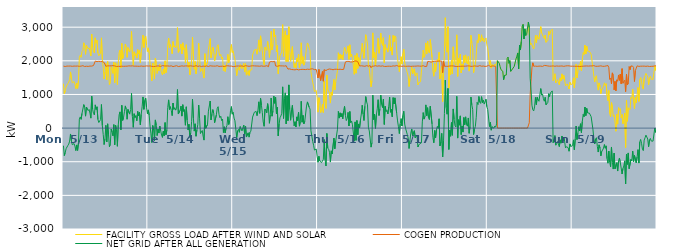
| Category | FACILITY GROSS LOAD AFTER WIND AND SOLAR | COGEN PRODUCTION | NET GRID AFTER ALL GENERATION |
|---|---|---|---|
|  Mon  5/13 | 1320 | 1843 | -523 |
|  Mon  5/13 | 1023 | 1841 | -818 |
|  Mon  5/13 | 1105 | 1831 | -726 |
|  Mon  5/13 | 1222 | 1835 | -613 |
|  Mon  5/13 | 1245 | 1844 | -599 |
|  Mon  5/13 | 1327 | 1844 | -517 |
|  Mon  5/13 | 1367 | 1843 | -476 |
|  Mon  5/13 | 1450 | 1837 | -387 |
|  Mon  5/13 | 1670 | 1845 | -175 |
|  Mon  5/13 | 1466 | 1844 | -378 |
|  Mon  5/13 | 1342 | 1837 | -495 |
|  Mon  5/13 | 1370 | 1836 | -466 |
|  Mon  5/13 | 1384 | 1844 | -460 |
|  Mon  5/13 | 1302 | 1836 | -534 |
|  Mon  5/13 | 1174 | 1842 | -668 |
|  Mon  5/13 | 1335 | 1836 | -501 |
|  Mon  5/13 | 1181 | 1845 | -664 |
|  Mon  5/13 | 1411 | 1851 | -440 |
|  Mon  5/13 | 2104 | 1837 | 267 |
|  Mon  5/13 | 2166 | 1833 | 333 |
|  Mon  5/13 | 2102 | 1842 | 260 |
|  Mon  5/13 | 2278 | 1841 | 437 |
|  Mon  5/13 | 2309 | 1855 | 454 |
|  Mon  5/13 | 2536 | 1838 | 698 |
|  Mon  5/13 | 2449 | 1831 | 618 |
|  Mon  5/13 | 2194 | 1839 | 355 |
|  Mon  5/13 | 2466 | 1839 | 627 |
|  Mon  5/13 | 2412 | 1845 | 567 |
|  Mon  5/13 | 2354 | 1834 | 520 |
|  Mon  5/13 | 2386 | 1832 | 554 |
|  Mon  5/13 | 2291 | 1844 | 447 |
|  Mon  5/13 | 2143 | 1847 | 296 |
|  Mon  5/13 | 2790 | 1843 | 947 |
|  Mon  5/13 | 2402 | 1840 | 562 |
|  Mon  5/13 | 2296 | 1859 | 437 |
|  Mon  5/13 | 2232 | 1842 | 390 |
|  Mon  5/13 | 2683 | 1992 | 691 |
|  Mon  5/13 | 2526 | 1974 | 552 |
|  Mon  5/13 | 2609 | 1976 | 633 |
|  Mon  5/13 | 2234 | 1979 | 255 |
|  Mon  5/13 | 2149 | 1984 | 165 |
|  Mon  5/13 | 2176 | 1988 | 188 |
|  Mon  5/13 | 2231 | 1977 | 254 |
|  Mon  5/13 | 2683 | 1983 | 700 |
|  Mon  5/13 | 2049 | 1976 | 73 |
|  Mon  5/13 | 1787 | 1979 | -192 |
|  Mon  5/13 | 1464 | 1953 | -489 |
|  Mon  5/13 | 1664 | 1981 | -317 |
|  Mon  5/13 | 1919 | 1837 | 82 |
|  Mon  5/13 | 1433 | 1845 | -412 |
|  Mon  5/13 | 1977 | 1850 | 127 |
|  Mon  5/13 | 1646 | 1843 | -197 |
|  Mon  5/13 | 1296 | 1850 | -554 |
|  Mon  5/13 | 1360 | 1843 | -483 |
|  Mon  5/13 | 1823 | 1851 | -28 |
|  Mon  5/13 | 1722 | 1838 | -116 |
|  Mon  5/13 | 1626 | 1857 | -231 |
|  Mon  5/13 | 1955 | 1852 | 103 |
|  Mon  5/13 | 1352 | 1849 | -497 |
|  Mon  5/13 | 1938 | 1855 | 83 |
|  Mon  5/13 | 1788 | 1831 | -43 |
|  Mon  5/13 | 1297 | 1838 | -541 |
|  Mon  5/13 | 1924 | 1837 | 87 |
|  Mon  5/13 | 2241 | 1845 | 396 |
|  Mon  5/13 | 2317 | 1834 | 483 |
|  Mon  5/13 | 1788 | 1839 | -51 |
|  Mon  5/13 | 2518 | 1841 | 677 |
|  Mon  5/13 | 2063 | 1835 | 228 |
|  Mon  5/13 | 2156 | 1837 | 319 |
|  Mon  5/13 | 2318 | 1830 | 488 |
|  Mon  5/13 | 2499 | 1839 | 660 |
|  Mon  5/13 | 2403 | 1844 | 559 |
|  Mon  5/13 | 2104 | 1841 | 263 |
|  Mon  5/13 | 2395 | 1840 | 555 |
|  Mon  5/13 | 2420 | 1849 | 571 |
|  Mon  5/13 | 2263 | 1848 | 415 |
|  Mon  5/13 | 2400 | 1846 | 554 |
|  Mon  5/13 | 2872 | 1839 | 1033 |
|  Mon  5/13 | 2197 | 1850 | 347 |
|  Mon  5/13 | 1872 | 1848 | 24 |
|  Mon  5/13 | 2268 | 1841 | 427 |
|  Mon  5/13 | 2158 | 1846 | 312 |
|  Mon  5/13 | 2217 | 1842 | 375 |
|  Mon  5/13 | 2081 | 1865 | 216 |
|  Mon  5/13 | 2335 | 1839 | 496 |
|  Mon  5/13 | 2202 | 1842 | 360 |
|  Mon  5/13 | 2309 | 1837 | 472 |
|  Mon  5/13 | 1941 | 1844 | 97 |
|  Mon  5/13 | 2254 | 1846 | 408 |
|  Mon  5/13 | 2465 | 1833 | 632 |
|  Mon  5/13 | 2764 | 1838 | 926 |
|  Mon  5/13 | 2394 | 1837 | 557 |
|  Mon  5/13 | 2664 | 1839 | 825 |
|  Mon  5/13 | 2736 | 1842 | 894 |
|  Mon  5/13 | 2461 | 1849 | 612 |
|  Mon  5/13 | 2276 | 1852 | 424 |
|  Tue  5/14 | 2385 | 1844 | 541 |
|  Tue  5/14 | 2236 | 1853 | 383 |
|  Tue  5/14 | 1905 | 1847 | 58 |
|  Tue  5/14 | 1672 | 1844 | -172 |
|  Tue  5/14 | 1406 | 1836 | -430 |
|  Tue  5/14 | 1935 | 1858 | 77 |
|  Tue  5/14 | 1771 | 1829 | -58 |
|  Tue  5/14 | 1458 | 1832 | -374 |
|  Tue  5/14 | 2079 | 1836 | 243 |
|  Tue  5/14 | 1929 | 1845 | 84 |
|  Tue  5/14 | 1624 | 1847 | -223 |
|  Tue  5/14 | 1817 | 1843 | -26 |
|  Tue  5/14 | 1699 | 1847 | -148 |
|  Tue  5/14 | 1904 | 1845 | 59 |
|  Tue  5/14 | 1756 | 1832 | -76 |
|  Tue  5/14 | 1641 | 1849 | -208 |
|  Tue  5/14 | 1581 | 1858 | -277 |
|  Tue  5/14 | 1752 | 1845 | -93 |
|  Tue  5/14 | 1619 | 1848 | -229 |
|  Tue  5/14 | 2001 | 1837 | 164 |
|  Tue  5/14 | 1649 | 1846 | -197 |
|  Tue  5/14 | 1783 | 1844 | -61 |
|  Tue  5/14 | 2460 | 1848 | 612 |
|  Tue  5/14 | 2675 | 1836 | 839 |
|  Tue  5/14 | 2396 | 1842 | 554 |
|  Tue  5/14 | 2484 | 1847 | 637 |
|  Tue  5/14 | 2376 | 1851 | 525 |
|  Tue  5/14 | 2210 | 1839 | 371 |
|  Tue  5/14 | 2573 | 1828 | 745 |
|  Tue  5/14 | 2411 | 1856 | 555 |
|  Tue  5/14 | 2447 | 1842 | 605 |
|  Tue  5/14 | 2384 | 1851 | 533 |
|  Tue  5/14 | 2443 | 1855 | 588 |
|  Tue  5/14 | 2987 | 1841 | 1146 |
|  Tue  5/14 | 2248 | 1830 | 418 |
|  Tue  5/14 | 2288 | 1856 | 432 |
|  Tue  5/14 | 2370 | 1839 | 531 |
|  Tue  5/14 | 2495 | 1841 | 654 |
|  Tue  5/14 | 2206 | 1850 | 356 |
|  Tue  5/14 | 2536 | 1840 | 696 |
|  Tue  5/14 | 2336 | 1841 | 495 |
|  Tue  5/14 | 2388 | 1840 | 548 |
|  Tue  5/14 | 1934 | 1848 | 86 |
|  Tue  5/14 | 2478 | 1845 | 633 |
|  Tue  5/14 | 2085 | 1848 | 237 |
|  Tue  5/14 | 1804 | 1860 | -56 |
|  Tue  5/14 | 1957 | 1843 | 114 |
|  Tue  5/14 | 1580 | 1854 | -274 |
|  Tue  5/14 | 1709 | 1851 | -142 |
|  Tue  5/14 | 2031 | 1840 | 191 |
|  Tue  5/14 | 2702 | 1841 | 861 |
|  Tue  5/14 | 2151 | 1852 | 299 |
|  Tue  5/14 | 1747 | 1837 | -90 |
|  Tue  5/14 | 1978 | 1850 | 128 |
|  Tue  5/14 | 1614 | 1856 | -242 |
|  Tue  5/14 | 1799 | 1850 | -51 |
|  Tue  5/14 | 1937 | 1834 | 103 |
|  Tue  5/14 | 2523 | 1837 | 686 |
|  Tue  5/14 | 2131 | 1847 | 284 |
|  Tue  5/14 | 1680 | 1843 | -163 |
|  Tue  5/14 | 1715 | 1832 | -117 |
|  Tue  5/14 | 1780 | 1852 | -72 |
|  Tue  5/14 | 1605 | 1843 | -238 |
|  Tue  5/14 | 1488 | 1845 | -357 |
|  Tue  5/14 | 2212 | 1836 | 376 |
|  Tue  5/14 | 1840 | 1846 | -6 |
|  Tue  5/14 | 1857 | 1849 | 8 |
|  Tue  5/14 | 1952 | 1841 | 111 |
|  Tue  5/14 | 2335 | 1832 | 503 |
|  Tue  5/14 | 2360 | 1836 | 524 |
|  Tue  5/14 | 2658 | 1853 | 805 |
|  Tue  5/14 | 2090 | 1847 | 243 |
|  Tue  5/14 | 2256 | 1845 | 411 |
|  Tue  5/14 | 2405 | 1855 | 550 |
|  Tue  5/14 | 2279 | 1842 | 437 |
|  Tue  5/14 | 1998 | 1839 | 159 |
|  Tue  5/14 | 2021 | 1842 | 179 |
|  Tue  5/14 | 2224 | 1829 | 395 |
|  Tue  5/14 | 2443 | 1854 | 589 |
|  Tue  5/14 | 2480 | 1844 | 636 |
|  Tue  5/14 | 2241 | 1833 | 408 |
|  Tue  5/14 | 2148 | 1839 | 309 |
|  Tue  5/14 | 2190 | 1838 | 352 |
|  Tue  5/14 | 2063 | 1841 | 222 |
|  Tue  5/14 | 2111 | 1841 | 270 |
|  Tue  5/14 | 1711 | 1844 | -133 |
|  Tue  5/14 | 1867 | 1828 | 39 |
|  Tue  5/14 | 1683 | 1828 | -145 |
|  Tue  5/14 | 1860 | 1851 | 9 |
|  Tue  5/14 | 1927 | 1847 | 80 |
|  Tue  5/14 | 2190 | 1852 | 338 |
|  Tue  5/14 | 1944 | 1837 | 107 |
|  Tue  5/14 | 2055 | 1844 | 211 |
|  Tue  5/14 | 2364 | 1849 | 515 |
|  Tue  5/14 | 2484 | 1844 | 640 |
|  Tue  5/14 | 2245 | 1832 | 413 |
|  Wed  5/15 | 2299 | 1827 | 472 |
|  Wed  5/15 | 2148 | 1850 | 298 |
|  Wed  5/15 | 2052 | 1835 | 217 |
|  Wed  5/15 | 2037 | 1843 | 194 |
|  Wed  5/15 | 1561 | 1844 | -283 |
|  Wed  5/15 | 1760 | 1844 | -84 |
|  Wed  5/15 | 1808 | 1846 | -38 |
|  Wed  5/15 | 1719 | 1844 | -125 |
|  Wed  5/15 | 1888 | 1842 | 46 |
|  Wed  5/15 | 1855 | 1836 | 19 |
|  Wed  5/15 | 1765 | 1849 | -84 |
|  Wed  5/15 | 1851 | 1839 | 12 |
|  Wed  5/15 | 1921 | 1833 | 88 |
|  Wed  5/15 | 1680 | 1851 | -171 |
|  Wed  5/15 | 1915 | 1855 | 60 |
|  Wed  5/15 | 1572 | 1838 | -266 |
|  Wed  5/15 | 1608 | 1846 | -238 |
|  Wed  5/15 | 1709 | 1849 | -140 |
|  Wed  5/15 | 1567 | 1836 | -269 |
|  Wed  5/15 | 1726 | 1849 | -123 |
|  Wed  5/15 | 1753 | 1846 | -93 |
|  Wed  5/15 | 1734 | 1854 | -120 |
|  Wed  5/15 | 2180 | 1852 | 328 |
|  Wed  5/15 | 2193 | 1838 | 355 |
|  Wed  5/15 | 2321 | 1849 | 472 |
|  Wed  5/15 | 2299 | 1834 | 465 |
|  Wed  5/15 | 2342 | 1846 | 496 |
|  Wed  5/15 | 2196 | 1826 | 370 |
|  Wed  5/15 | 2362 | 1845 | 517 |
|  Wed  5/15 | 2622 | 1841 | 781 |
|  Wed  5/15 | 2279 | 1839 | 440 |
|  Wed  5/15 | 2742 | 1856 | 886 |
|  Wed  5/15 | 2526 | 1849 | 677 |
|  Wed  5/15 | 2302 | 1845 | 457 |
|  Wed  5/15 | 2024 | 1839 | 185 |
|  Wed  5/15 | 1880 | 1826 | 54 |
|  Wed  5/15 | 2409 | 1841 | 568 |
|  Wed  5/15 | 2362 | 1830 | 532 |
|  Wed  5/15 | 2309 | 1855 | 454 |
|  Wed  5/15 | 2576 | 1850 | 726 |
|  Wed  5/15 | 2395 | 1826 | 569 |
|  Wed  5/15 | 2102 | 1959 | 143 |
|  Wed  5/15 | 2368 | 1975 | 393 |
|  Wed  5/15 | 2874 | 1980 | 894 |
|  Wed  5/15 | 2326 | 1972 | 354 |
|  Wed  5/15 | 2482 | 1971 | 511 |
|  Wed  5/15 | 2946 | 1994 | 952 |
|  Wed  5/15 | 2721 | 1985 | 736 |
|  Wed  5/15 | 2767 | 1848 | 919 |
|  Wed  5/15 | 2262 | 1838 | 424 |
|  Wed  5/15 | 2456 | 1837 | 619 |
|  Wed  5/15 | 1613 | 1846 | -233 |
|  Wed  5/15 | 1975 | 1854 | 121 |
|  Wed  5/15 | 2161 | 1854 | 307 |
|  Wed  5/15 | 2207 | 1849 | 358 |
|  Wed  5/15 | 2282 | 1841 | 441 |
|  Wed  5/15 | 3075 | 1849 | 1226 |
|  Wed  5/15 | 2133 | 1845 | 288 |
|  Wed  5/15 | 2727 | 1844 | 883 |
|  Wed  5/15 | 2895 | 1848 | 1047 |
|  Wed  5/15 | 1978 | 1854 | 124 |
|  Wed  5/15 | 2768 | 1801 | 967 |
|  Wed  5/15 | 1976 | 1755 | 221 |
|  Wed  5/15 | 3012 | 1728 | 1284 |
|  Wed  5/15 | 2305 | 1760 | 545 |
|  Wed  5/15 | 1986 | 1753 | 233 |
|  Wed  5/15 | 2289 | 1742 | 547 |
|  Wed  5/15 | 2424 | 1747 | 677 |
|  Wed  5/15 | 2048 | 1737 | 311 |
|  Wed  5/15 | 1802 | 1733 | 69 |
|  Wed  5/15 | 1920 | 1731 | 189 |
|  Wed  5/15 | 1781 | 1748 | 33 |
|  Wed  5/15 | 2082 | 1749 | 333 |
|  Wed  5/15 | 1971 | 1751 | 220 |
|  Wed  5/15 | 2199 | 1729 | 470 |
|  Wed  5/15 | 1793 | 1736 | 57 |
|  Wed  5/15 | 1939 | 1741 | 198 |
|  Wed  5/15 | 2536 | 1739 | 797 |
|  Wed  5/15 | 1922 | 1747 | 175 |
|  Wed  5/15 | 2125 | 1747 | 378 |
|  Wed  5/15 | 1871 | 1744 | 127 |
|  Wed  5/15 | 1947 | 1745 | 202 |
|  Wed  5/15 | 1922 | 1740 | 182 |
|  Wed  5/15 | 2392 | 1738 | 654 |
|  Wed  5/15 | 2531 | 1752 | 779 |
|  Wed  5/15 | 2493 | 1740 | 753 |
|  Wed  5/15 | 2363 | 1745 | 618 |
|  Wed  5/15 | 2316 | 1751 | 565 |
|  Wed  5/15 | 1678 | 1758 | -80 |
|  Wed  5/15 | 1497 | 1732 | -235 |
|  Wed  5/15 | 1363 | 1762 | -399 |
|  Wed  5/15 | 1237 | 1746 | -509 |
|  Wed  5/15 | 1084 | 1738 | -654 |
|  Wed  5/15 | 1085 | 1733 | -648 |
|  Wed  5/15 | 1122 | 1744 | -622 |
|  Wed  5/15 | 907 | 1743 | -836 |
|  Thu  5/16 | 474 | 1489 | -1015 |
|  Thu  5/16 | 904 | 1742 | -838 |
|  Thu  5/16 | 769 | 1748 | -979 |
|  Thu  5/16 | 460 | 1415 | -955 |
|  Thu  5/16 | 544 | 1571 | -1027 |
|  Thu  5/16 | 705 | 1684 | -979 |
|  Thu  5/16 | 463 | 1394 | -931 |
|  Thu  5/16 | 1397 | 1737 | -340 |
|  Thu  5/16 | 792 | 1736 | -944 |
|  Thu  5/16 | 584 | 1711 | -1127 |
|  Thu  5/16 | 1577 | 1737 | -160 |
|  Thu  5/16 | 1148 | 1743 | -595 |
|  Thu  5/16 | 1130 | 1757 | -627 |
|  Thu  5/16 | 1040 | 1757 | -717 |
|  Thu  5/16 | 744 | 1754 | -1010 |
|  Thu  5/16 | 1072 | 1748 | -676 |
|  Thu  5/16 | 974 | 1743 | -769 |
|  Thu  5/16 | 947 | 1734 | -787 |
|  Thu  5/16 | 1443 | 1741 | -298 |
|  Thu  5/16 | 1133 | 1749 | -616 |
|  Thu  5/16 | 1365 | 1754 | -389 |
|  Thu  5/16 | 1356 | 1749 | -393 |
|  Thu  5/16 | 1706 | 1740 | -34 |
|  Thu  5/16 | 2240 | 1744 | 496 |
|  Thu  5/16 | 2043 | 1746 | 297 |
|  Thu  5/16 | 2204 | 1750 | 454 |
|  Thu  5/16 | 2068 | 1737 | 331 |
|  Thu  5/16 | 2175 | 1742 | 433 |
|  Thu  5/16 | 2025 | 1749 | 276 |
|  Thu  5/16 | 2262 | 1745 | 517 |
|  Thu  5/16 | 2400 | 1753 | 647 |
|  Thu  5/16 | 2345 | 1967 | 378 |
|  Thu  5/16 | 2214 | 1991 | 223 |
|  Thu  5/16 | 2269 | 1982 | 287 |
|  Thu  5/16 | 2445 | 1978 | 467 |
|  Thu  5/16 | 2044 | 1981 | 63 |
|  Thu  5/16 | 2477 | 1983 | 494 |
|  Thu  5/16 | 2124 | 1964 | 160 |
|  Thu  5/16 | 2197 | 1986 | 211 |
|  Thu  5/16 | 2065 | 1969 | 96 |
|  Thu  5/16 | 2079 | 1980 | 99 |
|  Thu  5/16 | 1599 | 1987 | -388 |
|  Thu  5/16 | 2158 | 1974 | 184 |
|  Thu  5/16 | 1632 | 1997 | -365 |
|  Thu  5/16 | 2218 | 1991 | 227 |
|  Thu  5/16 | 1774 | 1972 | -198 |
|  Thu  5/16 | 2096 | 1973 | 123 |
|  Thu  5/16 | 1849 | 1846 | 3 |
|  Thu  5/16 | 2085 | 1852 | 233 |
|  Thu  5/16 | 2270 | 1852 | 418 |
|  Thu  5/16 | 2521 | 1842 | 679 |
|  Thu  5/16 | 2258 | 1845 | 413 |
|  Thu  5/16 | 2074 | 1849 | 225 |
|  Thu  5/16 | 2488 | 1837 | 651 |
|  Thu  5/16 | 2776 | 1840 | 936 |
|  Thu  5/16 | 2635 | 1856 | 779 |
|  Thu  5/16 | 2523 | 1832 | 691 |
|  Thu  5/16 | 1865 | 1840 | 25 |
|  Thu  5/16 | 1759 | 1844 | -85 |
|  Thu  5/16 | 1752 | 1858 | -106 |
|  Thu  5/16 | 1228 | 1794 | -566 |
|  Thu  5/16 | 1406 | 1839 | -433 |
|  Thu  5/16 | 2831 | 1854 | 977 |
|  Thu  5/16 | 2095 | 1841 | 254 |
|  Thu  5/16 | 2263 | 1846 | 417 |
|  Thu  5/16 | 1845 | 1854 | -9 |
|  Thu  5/16 | 2227 | 1841 | 386 |
|  Thu  5/16 | 2412 | 1841 | 571 |
|  Thu  5/16 | 2675 | 1831 | 844 |
|  Thu  5/16 | 2225 | 1850 | 375 |
|  Thu  5/16 | 2413 | 1844 | 569 |
|  Thu  5/16 | 2821 | 1840 | 981 |
|  Thu  5/16 | 2538 | 1839 | 699 |
|  Thu  5/16 | 2460 | 1849 | 611 |
|  Thu  5/16 | 2687 | 1828 | 859 |
|  Thu  5/16 | 1942 | 1834 | 108 |
|  Thu  5/16 | 2480 | 1832 | 648 |
|  Thu  5/16 | 2325 | 1833 | 492 |
|  Thu  5/16 | 2367 | 1842 | 525 |
|  Thu  5/16 | 2259 | 1840 | 419 |
|  Thu  5/16 | 2480 | 1849 | 631 |
|  Thu  5/16 | 2763 | 1839 | 924 |
|  Thu  5/16 | 2299 | 1828 | 471 |
|  Thu  5/16 | 2394 | 1836 | 558 |
|  Thu  5/16 | 2171 | 1836 | 335 |
|  Thu  5/16 | 2755 | 1849 | 906 |
|  Thu  5/16 | 2566 | 1850 | 716 |
|  Thu  5/16 | 2742 | 1843 | 899 |
|  Thu  5/16 | 2712 | 1838 | 874 |
|  Thu  5/16 | 2301 | 1861 | 440 |
|  Thu  5/16 | 2060 | 1847 | 213 |
|  Thu  5/16 | 1877 | 1838 | 39 |
|  Thu  5/16 | 1678 | 1841 | -163 |
|  Thu  5/16 | 1971 | 1843 | 128 |
|  Thu  5/16 | 2123 | 1842 | 281 |
|  Thu  5/16 | 1901 | 1837 | 64 |
|  Fri  5/17 | 2212 | 1836 | 376 |
|  Fri  5/17 | 2345 | 1844 | 501 |
|  Fri  5/17 | 1970 | 1839 | 131 |
|  Fri  5/17 | 1833 | 1837 | -4 |
|  Fri  5/17 | 1834 | 1853 | -19 |
|  Fri  5/17 | 1649 | 1839 | -190 |
|  Fri  5/17 | 1550 | 1847 | -297 |
|  Fri  5/17 | 1236 | 1842 | -606 |
|  Fri  5/17 | 1470 | 1837 | -367 |
|  Fri  5/17 | 1684 | 1834 | -150 |
|  Fri  5/17 | 1817 | 1843 | -26 |
|  Fri  5/17 | 1614 | 1839 | -225 |
|  Fri  5/17 | 1627 | 1848 | -221 |
|  Fri  5/17 | 1761 | 1840 | -79 |
|  Fri  5/17 | 1546 | 1839 | -293 |
|  Fri  5/17 | 1544 | 1842 | -298 |
|  Fri  5/17 | 1642 | 1855 | -213 |
|  Fri  5/17 | 1287 | 1848 | -561 |
|  Fri  5/17 | 1348 | 1849 | -501 |
|  Fri  5/17 | 1373 | 1842 | -469 |
|  Fri  5/17 | 1378 | 1856 | -478 |
|  Fri  5/17 | 1401 | 1840 | -439 |
|  Fri  5/17 | 2028 | 1844 | 184 |
|  Fri  5/17 | 2316 | 1855 | 461 |
|  Fri  5/17 | 2104 | 1837 | 267 |
|  Fri  5/17 | 2181 | 1832 | 349 |
|  Fri  5/17 | 2532 | 1842 | 690 |
|  Fri  5/17 | 2203 | 1835 | 368 |
|  Fri  5/17 | 2582 | 1976 | 606 |
|  Fri  5/17 | 2280 | 1972 | 308 |
|  Fri  5/17 | 2233 | 1979 | 254 |
|  Fri  5/17 | 2635 | 1987 | 648 |
|  Fri  5/17 | 2619 | 1960 | 659 |
|  Fri  5/17 | 2102 | 1978 | 124 |
|  Fri  5/17 | 1702 | 1981 | -279 |
|  Fri  5/17 | 1541 | 1978 | -437 |
|  Fri  5/17 | 1915 | 1987 | -72 |
|  Fri  5/17 | 1682 | 1976 | -294 |
|  Fri  5/17 | 1932 | 1988 | -56 |
|  Fri  5/17 | 2041 | 1991 | 50 |
|  Fri  5/17 | 1981 | 1989 | -8 |
|  Fri  5/17 | 2252 | 1976 | 276 |
|  Fri  5/17 | 1465 | 1994 | -529 |
|  Fri  5/17 | 1580 | 1995 | -415 |
|  Fri  5/17 | 1834 | 1990 | -156 |
|  Fri  5/17 | 789 | 1648 | -859 |
|  Fri  5/17 | 1605 | 1985 | -380 |
|  Fri  5/17 | 2272 | 1840 | 432 |
|  Fri  5/17 | 3281 | 1854 | 1427 |
|  Fri  5/17 | 2444 | 1837 | 607 |
|  Fri  5/17 | 2257 | 1845 | 412 |
|  Fri  5/17 | 3015 | 1837 | 1178 |
|  Fri  5/17 | 1189 | 1824 | -635 |
|  Fri  5/17 | 1784 | 1846 | -62 |
|  Fri  5/17 | 1591 | 1834 | -243 |
|  Fri  5/17 | 2014 | 1849 | 165 |
|  Fri  5/17 | 1614 | 1829 | -215 |
|  Fri  5/17 | 2416 | 1847 | 569 |
|  Fri  5/17 | 2107 | 1848 | 259 |
|  Fri  5/17 | 1906 | 1837 | 69 |
|  Fri  5/17 | 1870 | 1837 | 33 |
|  Fri  5/17 | 2773 | 1830 | 943 |
|  Fri  5/17 | 1538 | 1835 | -297 |
|  Fri  5/17 | 2084 | 1835 | 249 |
|  Fri  5/17 | 1931 | 1844 | 87 |
|  Fri  5/17 | 2200 | 1837 | 363 |
|  Fri  5/17 | 1639 | 1832 | -193 |
|  Fri  5/17 | 1901 | 1841 | 60 |
|  Fri  5/17 | 1739 | 1858 | -119 |
|  Fri  5/17 | 2155 | 1840 | 315 |
|  Fri  5/17 | 1940 | 1841 | 99 |
|  Fri  5/17 | 2175 | 1841 | 334 |
|  Fri  5/17 | 1961 | 1855 | 106 |
|  Fri  5/17 | 1905 | 1848 | 57 |
|  Fri  5/17 | 2134 | 1833 | 301 |
|  Fri  5/17 | 1694 | 1848 | -154 |
|  Fri  5/17 | 1886 | 1842 | 44 |
|  Fri  5/17 | 2758 | 1835 | 923 |
|  Fri  5/17 | 2533 | 1841 | 692 |
|  Fri  5/17 | 2390 | 1838 | 552 |
|  Fri  5/17 | 1646 | 1838 | -192 |
|  Fri  5/17 | 1811 | 1848 | -37 |
|  Fri  5/17 | 1894 | 1845 | 49 |
|  Fri  5/17 | 2164 | 1842 | 322 |
|  Fri  5/17 | 2601 | 1839 | 762 |
|  Fri  5/17 | 2541 | 1838 | 703 |
|  Fri  5/17 | 2789 | 1850 | 939 |
|  Fri  5/17 | 2628 | 1858 | 770 |
|  Fri  5/17 | 2567 | 1833 | 734 |
|  Fri  5/17 | 2774 | 1839 | 935 |
|  Fri  5/17 | 2600 | 1842 | 758 |
|  Fri  5/17 | 2678 | 1845 | 833 |
|  Fri  5/17 | 2557 | 1844 | 713 |
|  Fri  5/17 | 2563 | 1834 | 729 |
|  Fri  5/17 | 2681 | 1824 | 857 |
|  Fri  5/17 | 2474 | 1839 | 635 |
|  Sat  5/18 | 2385 | 1837 | 548 |
|  Sat  5/18 | 2405 | 1866 | 539 |
|  Sat  5/18 | 1892 | 1846 | 46 |
|  Sat  5/18 | 2003 | 1832 | 171 |
|  Sat  5/18 | 1783 | 1845 | -62 |
|  Sat  5/18 | 1884 | 1846 | 38 |
|  Sat  5/18 | 1881 | 1832 | 49 |
|  Sat  5/18 | 1841 | 1844 | -3 |
|  Sat  5/18 | 1904 | 1844 | 60 |
|  Sat  5/18 | 1860 | 1834 | 26 |
|  Sat  5/18 | 1952 | 1827 | 125 |
|  Sat  5/18 | 2004 | 0 | 2004 |
|  Sat  5/18 | 1963 | 0 | 1963 |
|  Sat  5/18 | 1930 | 0 | 1930 |
|  Sat  5/18 | 1826 | 0 | 1826 |
|  Sat  5/18 | 1736 | 0 | 1736 |
|  Sat  5/18 | 1718 | 0 | 1718 |
|  Sat  5/18 | 1691 | 0 | 1691 |
|  Sat  5/18 | 1439 | 0 | 1439 |
|  Sat  5/18 | 1566 | 0 | 1566 |
|  Sat  5/18 | 1569 | 0 | 1569 |
|  Sat  5/18 | 1577 | 0 | 1577 |
|  Sat  5/18 | 2070 | 0 | 2070 |
|  Sat  5/18 | 2112 | 0 | 2112 |
|  Sat  5/18 | 1925 | 0 | 1925 |
|  Sat  5/18 | 2004 | 0 | 2004 |
|  Sat  5/18 | 1687 | 0 | 1687 |
|  Sat  5/18 | 1672 | 0 | 1672 |
|  Sat  5/18 | 1758 | 0 | 1758 |
|  Sat  5/18 | 1745 | 0 | 1745 |
|  Sat  5/18 | 1835 | 0 | 1835 |
|  Sat  5/18 | 1836 | 0 | 1836 |
|  Sat  5/18 | 2056 | 0 | 2056 |
|  Sat  5/18 | 2138 | 0 | 2138 |
|  Sat  5/18 | 2234 | 0 | 2234 |
|  Sat  5/18 | 1762 | 0 | 1762 |
|  Sat  5/18 | 2467 | 0 | 2467 |
|  Sat  5/18 | 2321 | 0 | 2321 |
|  Sat  5/18 | 2579 | 0 | 2579 |
|  Sat  5/18 | 3025 | 0 | 3025 |
|  Sat  5/18 | 3083 | 0 | 3083 |
|  Sat  5/18 | 2649 | 0 | 2649 |
|  Sat  5/18 | 2948 | 0 | 2948 |
|  Sat  5/18 | 2750 | 0 | 2750 |
|  Sat  5/18 | 2780 | 0 | 2780 |
|  Sat  5/18 | 2763 | 0 | 2763 |
|  Sat  5/18 | 3154 | 0 | 3154 |
|  Sat  5/18 | 3148 | 158 | 2990 |
|  Sat  5/18 | 2474 | 990 | 1484 |
|  Sat  5/18 | 2529 | 1393 | 1136 |
|  Sat  5/18 | 2473 | 1793 | 680 |
|  Sat  5/18 | 2485 | 1941 | 544 |
|  Sat  5/18 | 2351 | 1840 | 511 |
|  Sat  5/18 | 2479 | 1850 | 629 |
|  Sat  5/18 | 2754 | 1842 | 912 |
|  Sat  5/18 | 2539 | 1840 | 699 |
|  Sat  5/18 | 2755 | 1836 | 919 |
|  Sat  5/18 | 2678 | 1844 | 834 |
|  Sat  5/18 | 2639 | 1842 | 797 |
|  Sat  5/18 | 2630 | 1834 | 796 |
|  Sat  5/18 | 3017 | 1843 | 1174 |
|  Sat  5/18 | 2826 | 1845 | 981 |
|  Sat  5/18 | 2850 | 1834 | 1016 |
|  Sat  5/18 | 2715 | 1842 | 873 |
|  Sat  5/18 | 2660 | 1862 | 798 |
|  Sat  5/18 | 2765 | 1850 | 915 |
|  Sat  5/18 | 2549 | 1858 | 691 |
|  Sat  5/18 | 2531 | 1836 | 695 |
|  Sat  5/18 | 2611 | 1847 | 764 |
|  Sat  5/18 | 2873 | 1850 | 1023 |
|  Sat  5/18 | 2777 | 1840 | 937 |
|  Sat  5/18 | 2883 | 1834 | 1049 |
|  Sat  5/18 | 2869 | 1843 | 1026 |
|  Sat  5/18 | 2940 | 1834 | 1106 |
|  Sat  5/18 | 1412 | 1848 | -436 |
|  Sat  5/18 | 1502 | 1835 | -333 |
|  Sat  5/18 | 1616 | 1838 | -222 |
|  Sat  5/18 | 1341 | 1849 | -508 |
|  Sat  5/18 | 1389 | 1847 | -458 |
|  Sat  5/18 | 1440 | 1842 | -402 |
|  Sat  5/18 | 1461 | 1841 | -380 |
|  Sat  5/18 | 1284 | 1835 | -551 |
|  Sat  5/18 | 1494 | 1844 | -350 |
|  Sat  5/18 | 1401 | 1848 | -447 |
|  Sat  5/18 | 1612 | 1847 | -235 |
|  Sat  5/18 | 1453 | 1837 | -384 |
|  Sat  5/18 | 1568 | 1835 | -267 |
|  Sat  5/18 | 1437 | 1835 | -398 |
|  Sat  5/18 | 1258 | 1846 | -588 |
|  Sat  5/18 | 1285 | 1840 | -555 |
|  Sat  5/18 | 1313 | 1852 | -539 |
|  Sat  5/18 | 1247 | 1828 | -581 |
|  Sat  5/18 | 1162 | 1850 | -688 |
|  Sat  5/18 | 1363 | 1834 | -471 |
|  Sat  5/18 | 1295 | 1840 | -545 |
|  Sat  5/18 | 1303 | 1836 | -533 |
|  Sun  5/19 | 1320 | 1840 | -520 |
|  Sun  5/19 | 1496 | 1847 | -351 |
|  Sun  5/19 | 1196 | 1839 | -643 |
|  Sun  5/19 | 1497 | 1820 | -323 |
|  Sun  5/19 | 1899 | 1837 | 62 |
|  Sun  5/19 | 1494 | 1834 | -340 |
|  Sun  5/19 | 1685 | 1838 | -153 |
|  Sun  5/19 | 1879 | 1839 | 40 |
|  Sun  5/19 | 1746 | 1830 | -84 |
|  Sun  5/19 | 1980 | 1851 | 129 |
|  Sun  5/19 | 1703 | 1837 | -134 |
|  Sun  5/19 | 2035 | 1837 | 198 |
|  Sun  5/19 | 2246 | 1841 | 405 |
|  Sun  5/19 | 2186 | 1846 | 340 |
|  Sun  5/19 | 2470 | 1845 | 625 |
|  Sun  5/19 | 2207 | 1836 | 371 |
|  Sun  5/19 | 2433 | 1847 | 586 |
|  Sun  5/19 | 2290 | 1841 | 449 |
|  Sun  5/19 | 2291 | 1843 | 448 |
|  Sun  5/19 | 2285 | 1840 | 445 |
|  Sun  5/19 | 2267 | 1848 | 419 |
|  Sun  5/19 | 2193 | 1854 | 339 |
|  Sun  5/19 | 2192 | 1847 | 345 |
|  Sun  5/19 | 1798 | 1830 | -32 |
|  Sun  5/19 | 1550 | 1858 | -308 |
|  Sun  5/19 | 1374 | 1846 | -472 |
|  Sun  5/19 | 1511 | 1838 | -327 |
|  Sun  5/19 | 1558 | 1844 | -286 |
|  Sun  5/19 | 1292 | 1838 | -546 |
|  Sun  5/19 | 1129 | 1841 | -712 |
|  Sun  5/19 | 1344 | 1842 | -498 |
|  Sun  5/19 | 1243 | 1835 | -592 |
|  Sun  5/19 | 1024 | 1851 | -827 |
|  Sun  5/19 | 1155 | 1845 | -690 |
|  Sun  5/19 | 1186 | 1836 | -650 |
|  Sun  5/19 | 1245 | 1840 | -595 |
|  Sun  5/19 | 1347 | 1837 | -490 |
|  Sun  5/19 | 1265 | 1864 | -599 |
|  Sun  5/19 | 1320 | 1848 | -528 |
|  Sun  5/19 | 966 | 1874 | -908 |
|  Sun  5/19 | 816 | 1860 | -1044 |
|  Sun  5/19 | 1116 | 1799 | -683 |
|  Sun  5/19 | 430 | 1446 | -1016 |
|  Sun  5/19 | 338 | 1489 | -1151 |
|  Sun  5/19 | 756 | 1318 | -562 |
|  Sun  5/19 | 630 | 1642 | -1012 |
|  Sun  5/19 | 346 | 1564 | -1218 |
|  Sun  5/19 | 394 | 1138 | -744 |
|  Sun  5/19 | 176 | 1388 | -1212 |
|  Sun  5/19 | -93 | 1109 | -1202 |
|  Sun  5/19 | 407 | 1436 | -1029 |
|  Sun  5/19 | 117 | 1394 | -1277 |
|  Sun  5/19 | 607 | 1579 | -972 |
|  Sun  5/19 | 531 | 1420 | -889 |
|  Sun  5/19 | 579 | 1607 | -1028 |
|  Sun  5/19 | 297 | 1316 | -1019 |
|  Sun  5/19 | 402 | 1767 | -1365 |
|  Sun  5/19 | 133 | 1332 | -1199 |
|  Sun  5/19 | 256 | 1383 | -1127 |
|  Sun  5/19 | 448 | 1422 | -974 |
|  Sun  5/19 | -577 | 1083 | -1660 |
|  Sun  5/19 | 830 | 1602 | -772 |
|  Sun  5/19 | 203 | 1283 | -1080 |
|  Sun  5/19 | 600 | 1339 | -739 |
|  Sun  5/19 | 621 | 1828 | -1207 |
|  Sun  5/19 | 551 | 1737 | -1186 |
|  Sun  5/19 | 918 | 1847 | -929 |
|  Sun  5/19 | 879 | 1859 | -980 |
|  Sun  5/19 | 1157 | 1841 | -684 |
|  Sun  5/19 | 808 | 1804 | -996 |
|  Sun  5/19 | 573 | 1386 | -813 |
|  Sun  5/19 | 911 | 1710 | -799 |
|  Sun  5/19 | 749 | 1779 | -1030 |
|  Sun  5/19 | 992 | 1850 | -858 |
|  Sun  5/19 | 1206 | 1847 | -641 |
|  Sun  5/19 | 794 | 1834 | -1040 |
|  Sun  5/19 | 1433 | 1849 | -416 |
|  Sun  5/19 | 1503 | 1840 | -337 |
|  Sun  5/19 | 1398 | 1849 | -451 |
|  Sun  5/19 | 1217 | 1841 | -624 |
|  Sun  5/19 | 1159 | 1829 | -670 |
|  Sun  5/19 | 1484 | 1842 | -358 |
|  Sun  5/19 | 1560 | 1846 | -286 |
|  Sun  5/19 | 1627 | 1836 | -209 |
|  Sun  5/19 | 1645 | 1839 | -194 |
|  Sun  5/19 | 1519 | 1843 | -324 |
|  Sun  5/19 | 1290 | 1844 | -554 |
|  Sun  5/19 | 1479 | 1831 | -352 |
|  Sun  5/19 | 1537 | 1845 | -308 |
|  Sun  5/19 | 1451 | 1836 | -385 |
|  Sun  5/19 | 1439 | 1831 | -392 |
|  Sun  5/19 | 1450 | 1838 | -388 |
|  Sun  5/19 | 1438 | 1828 | -390 |
|  Sun  5/19 | 1851 | 1848 | 3 |
|  Sun  5/19 | 1711 | 1843 | -132 |
|  Sun  5/19 | 1722 | 1853 | -131 |